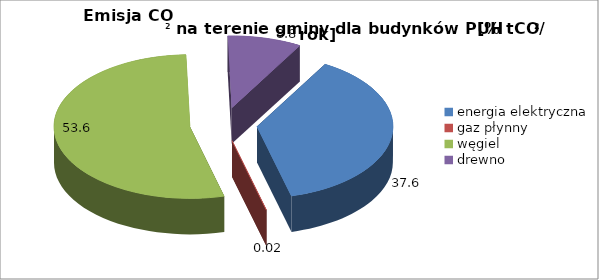
| Category | 37,6 0,02 53,6 8,8 |
|---|---|
| energia elektryczna | 37.582 |
| gaz płynny | 0.02 |
| węgiel | 53.594 |
| drewno | 8.805 |